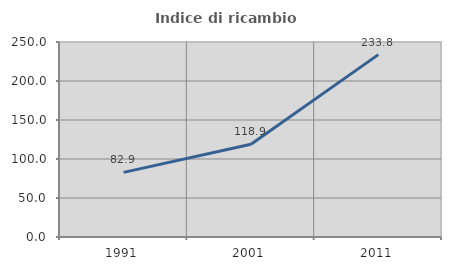
| Category | Indice di ricambio occupazionale  |
|---|---|
| 1991.0 | 82.87 |
| 2001.0 | 118.926 |
| 2011.0 | 233.84 |